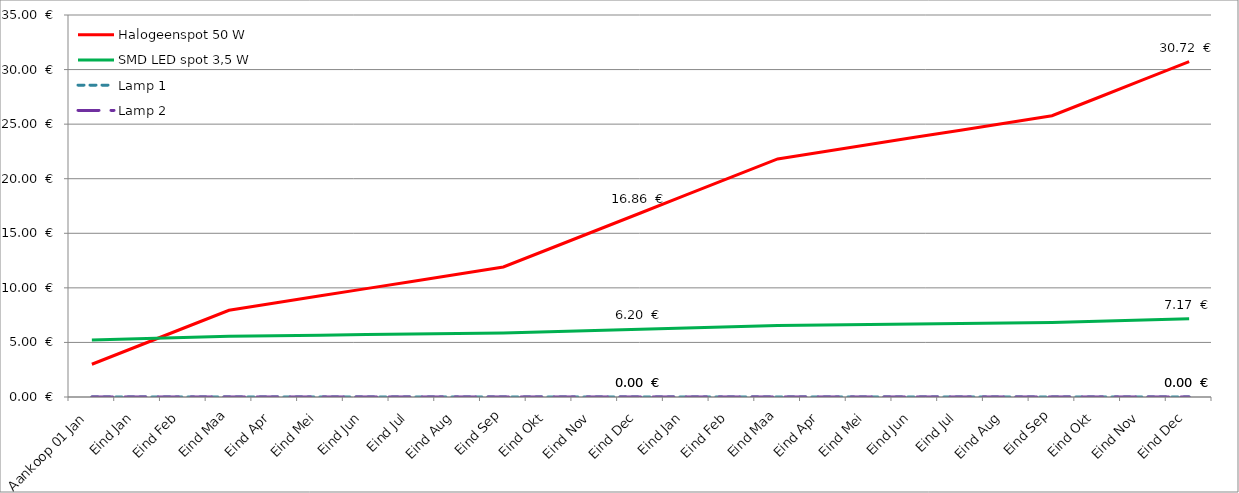
| Category | Halogeenspot 50 W | SMD LED spot 3,5 W | Lamp 1 | Lamp 2 |
|---|---|---|---|---|
| Aankoop 01 Jan | 3 | 5.23 | 0 | 0 |
| Eind Jan | 4.65 | 5.346 | 0 | 0 |
| Eind Feb | 6.3 | 5.461 | 0 | 0 |
| Eind Maa | 7.95 | 5.576 | 0 | 0 |
| Eind Apr | 8.61 | 5.623 | 0 | 0 |
| Eind Mei | 9.27 | 5.669 | 0 | 0 |
| Eind Jun | 9.93 | 5.715 | 0 | 0 |
| Eind Jul | 10.59 | 5.761 | 0 | 0 |
| Eind Aug | 11.25 | 5.807 | 0 | 0 |
| Eind Sep | 11.91 | 5.854 | 0 | 0 |
| Eind Okt | 13.56 | 5.969 | 0 | 0 |
| Eind Nov | 15.21 | 6.085 | 0 | 0 |
| Eind Dec | 16.86 | 6.2 | 0 | 0 |
| Eind Jan | 18.51 | 6.316 | 0 | 0 |
| Eind Feb | 20.16 | 6.431 | 0 | 0 |
| Eind Maa | 21.81 | 6.547 | 0 | 0 |
| Eind Apr | 22.47 | 6.593 | 0 | 0 |
| Eind Mei | 23.13 | 6.639 | 0 | 0 |
| Eind Jun | 23.79 | 6.685 | 0 | 0 |
| Eind Jul | 24.45 | 6.731 | 0 | 0 |
| Eind Aug | 25.11 | 6.778 | 0 | 0 |
| Eind Sep | 25.77 | 6.824 | 0 | 0 |
| Eind Okt | 27.42 | 6.939 | 0 | 0 |
| Eind Nov | 29.07 | 7.055 | 0 | 0 |
| Eind Dec | 30.72 | 7.17 | 0 | 0 |